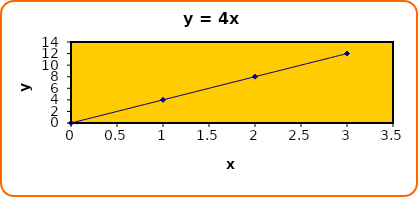
| Category | Series 0 |
|---|---|
| 0.0 | 0 |
| 1.0 | 4 |
| 2.0 | 8 |
| 3.0 | 12 |